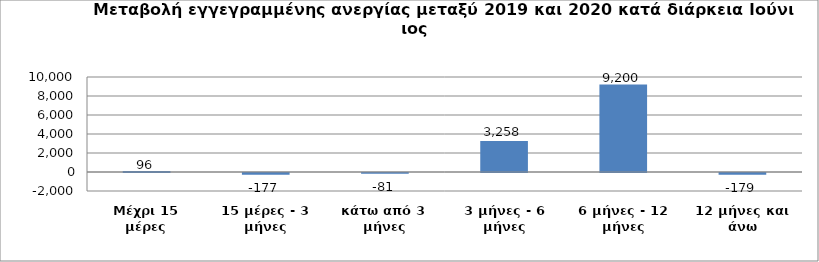
| Category | Series 0 |
|---|---|
| Μέχρι 15 μέρες | 96 |
| 15 μέρες - 3 μήνες | -177 |
| κάτω από 3 μήνες | -81 |
| 3 μήνες - 6 μήνες | 3258 |
| 6 μήνες - 12 μήνες | 9200 |
| 12 μήνες και άνω | -179 |